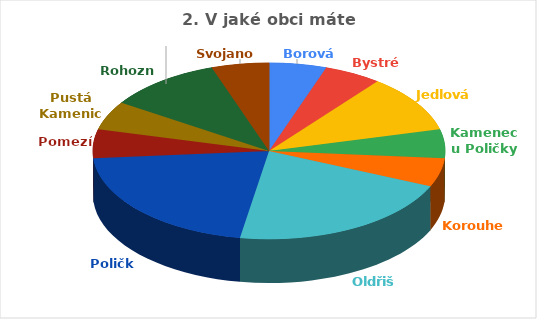
| Category | Series 0 |
|---|---|
| Borová | 1 |
| Bystré | 1 |
| Jedlová | 2 |
| Kamenec u Poličky | 1 |
| Korouhev | 1 |
| Oldřiš | 4 |
| Polička | 4 |
| Pomezí | 1 |
| Pustá Kamenice | 1 |
| Rohozná | 2 |
| Svojanov | 1 |